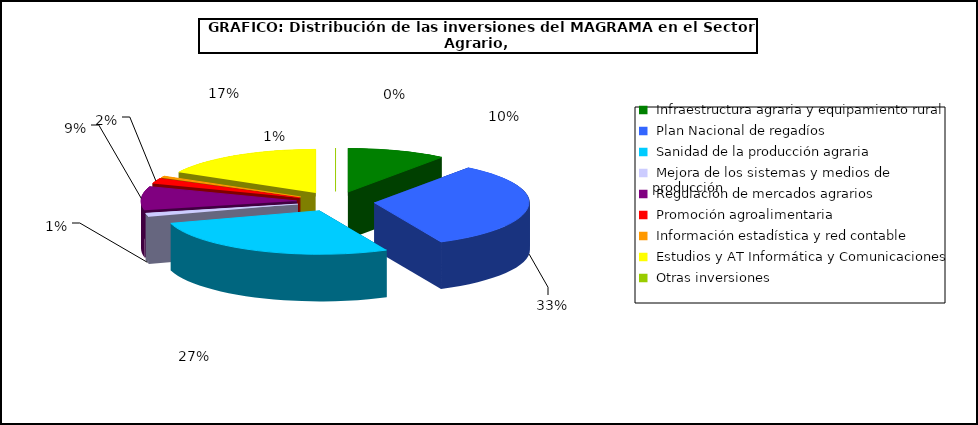
| Category | Series 0 |
|---|---|
|  Infraestructura agraria y equipamiento rural | 8168.74 |
|  Plan Nacional de regadíos | 25958.23 |
|  Sanidad de la producción agraria | 21746.49 |
|  Mejora de los sistemas y medios de producción | 1005.95 |
|  Regulación de mercados agrarios | 6952.92 |
|  Promoción agroalimentaria | 1519.78 |
|  Información estadística y red contable  | 533.89 |
|  Estudios y AT Informática y Comunicaciones | 13580.71 |
|  Otras inversiones | 0 |